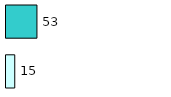
| Category | Series 0 | Series 1 |
|---|---|---|
| 0 | 15 | 53 |